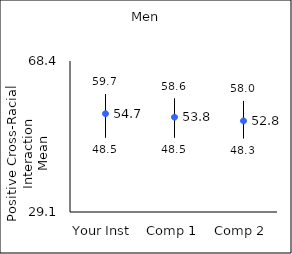
| Category | 25th percentile | 75th percentile | Mean |
|---|---|---|---|
| Your Inst | 48.5 | 59.7 | 54.68 |
| Comp 1 | 48.5 | 58.6 | 53.78 |
| Comp 2 | 48.3 | 58 | 52.81 |